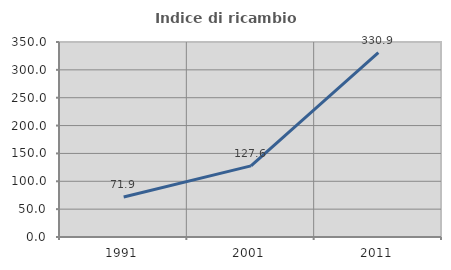
| Category | Indice di ricambio occupazionale  |
|---|---|
| 1991.0 | 71.937 |
| 2001.0 | 127.65 |
| 2011.0 | 330.928 |